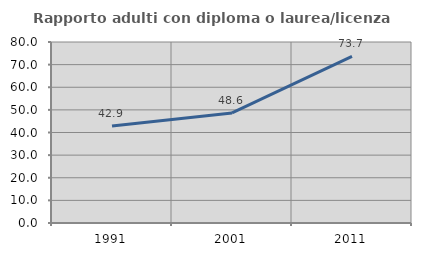
| Category | Rapporto adulti con diploma o laurea/licenza media  |
|---|---|
| 1991.0 | 42.857 |
| 2001.0 | 48.649 |
| 2011.0 | 73.684 |